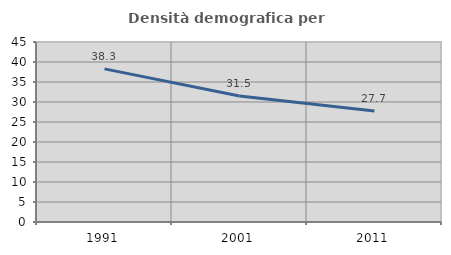
| Category | Densità demografica |
|---|---|
| 1991.0 | 38.275 |
| 2001.0 | 31.504 |
| 2011.0 | 27.737 |